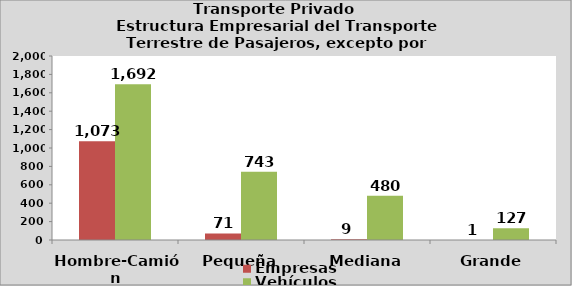
| Category | Empresas | Vehículos |
|---|---|---|
| Hombre-Camión | 1073 | 1692 |
| Pequeña | 71 | 743 |
| Mediana | 9 | 480 |
| Grande | 1 | 127 |